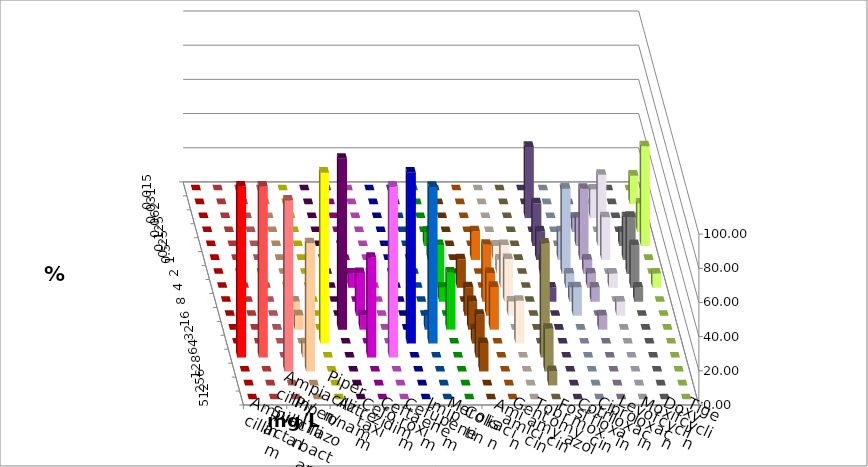
| Category | Ampicillin | Ampicillin/ Sulbactam | Piperacillin | Piperacillin/ Tazobactam | Aztreonam | Cefotaxim | Ceftazidim | Cefuroxim | Imipenem | Meropenem | Colistin | Amikacin | Gentamicin | Tobramycin | Fosfomycin | Cotrimoxazol | Ciprofloxacin | Levofloxacin | Moxifloxacin | Doxycyclin | Tigecyclin |
|---|---|---|---|---|---|---|---|---|---|---|---|---|---|---|---|---|---|---|---|---|---|
| 0.015 | 0 | 0 | 0 | 0 | 0 | 0 | 0 | 0 | 0 | 0 | 0 | 0 | 0 | 0 | 0 | 0 | 0 | 0 | 0 | 0 | 0 |
| 0.031 | 0 | 0 | 0 | 0 | 0 | 0 | 0 | 0 | 0 | 0 | 0 | 0 | 0 | 0 | 0 | 0 | 0 | 0 | 0 | 0 | 16.667 |
| 0.062 | 0 | 0 | 0 | 0 | 0 | 0 | 0 | 0 | 0 | 0 | 0 | 0 | 0 | 0 | 0 | 41.667 | 0 | 0 | 16.667 | 0 | 0 |
| 0.125 | 0 | 0 | 0 | 0 | 0 | 0 | 0 | 0 | 0 | 0 | 0 | 0 | 0 | 0 | 0 | 0 | 0 | 8.333 | 0 | 0 | 16.667 |
| 0.25 | 0 | 0 | 0 | 0 | 0 | 0 | 0 | 0 | 0 | 0 | 8.333 | 0 | 0 | 0 | 0 | 25 | 0 | 16.667 | 41.667 | 8.333 | 58.333 |
| 0.5 | 0 | 0 | 0 | 0 | 0 | 0 | 0 | 0 | 0 | 0 | 16.667 | 0 | 16.667 | 8.333 | 0 | 16.667 | 16.667 | 41.667 | 25 | 25 | 0 |
| 1.0 | 0 | 0 | 0 | 0 | 0 | 0 | 0 | 0 | 0 | 0 | 8.333 | 0 | 0 | 8.333 | 0 | 8.333 | 50 | 8.333 | 0 | 33.333 | 0 |
| 2.0 | 0 | 0 | 0 | 0 | 0 | 0 | 8.333 | 0 | 0 | 0 | 25 | 16.667 | 0 | 25 | 0 | 0 | 8.333 | 8.333 | 8.333 | 25 | 8.333 |
| 4.0 | 0 | 0 | 0 | 0 | 0 | 0 | 0 | 0 | 0 | 0 | 8.333 | 0 | 33.333 | 25 | 0 | 8.333 | 8.333 | 8.333 | 0 | 8.333 | 0 |
| 8.0 | 0 | 0 | 0 | 8.333 | 0 | 0 | 25 | 0 | 0 | 0 | 0 | 16.667 | 25 | 8.333 | 0 | 0 | 16.667 | 0 | 8.333 | 0 | 0 |
| 16.0 | 0 | 0 | 0 | 8.333 | 0 | 100 | 8.333 | 0 | 0 | 8.333 | 33.333 | 16.667 | 25 | 0 | 0 | 0 | 0 | 8.333 | 0 | 0 | 0 |
| 32.0 | 0 | 0 | 0 | 0 | 100 | 0 | 0 | 0 | 100 | 91.667 | 0 | 8.333 | 0 | 25 | 0 | 0 | 0 | 0 | 0 | 0 | 0 |
| 64.0 | 100 | 100 | 0 | 8.333 | 0 | 0 | 58.333 | 100 | 0 | 0 | 0 | 25 | 0 | 0 | 66.667 | 0 | 0 | 0 | 0 | 0 | 0 |
| 128.0 | 0 | 0 | 100 | 75 | 0 | 0 | 0 | 0 | 0 | 0 | 0 | 16.667 | 0 | 0 | 25 | 0 | 0 | 0 | 0 | 0 | 0 |
| 256.0 | 0 | 0 | 0 | 0 | 0 | 0 | 0 | 0 | 0 | 0 | 0 | 0 | 0 | 0 | 8.333 | 0 | 0 | 0 | 0 | 0 | 0 |
| 512.0 | 0 | 0 | 0 | 0 | 0 | 0 | 0 | 0 | 0 | 0 | 0 | 0 | 0 | 0 | 0 | 0 | 0 | 0 | 0 | 0 | 0 |